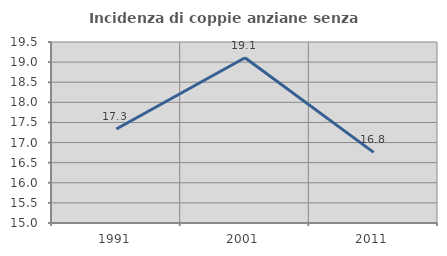
| Category | Incidenza di coppie anziane senza figli  |
|---|---|
| 1991.0 | 17.337 |
| 2001.0 | 19.11 |
| 2011.0 | 16.757 |